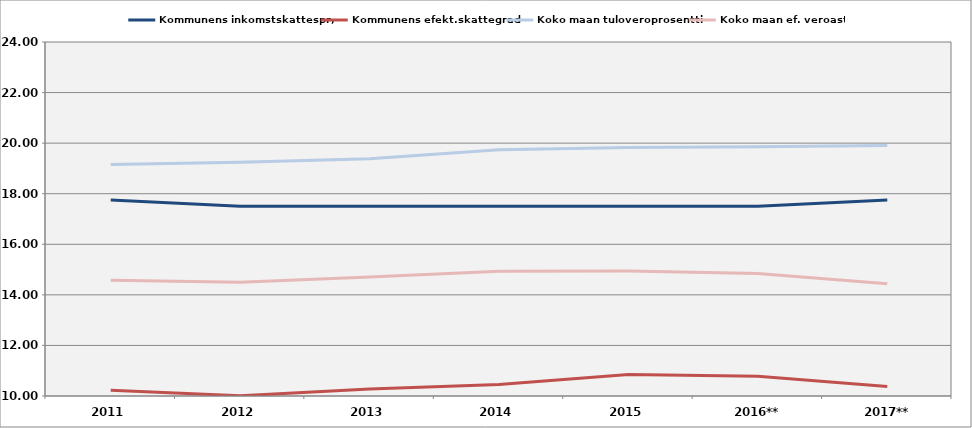
| Category | Kommunens inkomstskattespr, | Kommunens efekt.skattegrad | Koko maan tuloveroprosentti | Koko maan ef. veroaste |
|---|---|---|---|---|
| 2011 | 17.75 | 10.225 | 19.16 | 14.573 |
| 2012 | 17.5 | 10.008 | 19.24 | 14.494 |
| 2013 | 17.5 | 10.276 | 19.38 | 14.71 |
| 2014 | 17.5 | 10.45 | 19.74 | 14.934 |
| 2015 | 17.5 | 10.846 | 19.83 | 14.944 |
| 2016** | 17.5 | 10.778 | 19.86 | 14.849 |
| 2017** | 17.75 | 10.372 | 19.91 | 14.437 |